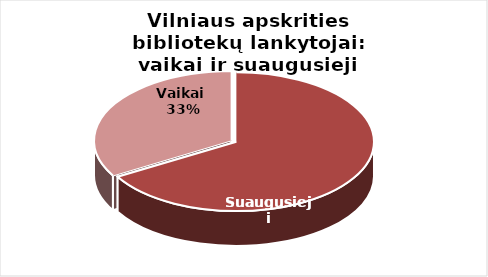
| Category | Series 0 |
|---|---|
| Suaugusieji | 1072101 |
| Vaikai  | 538561 |